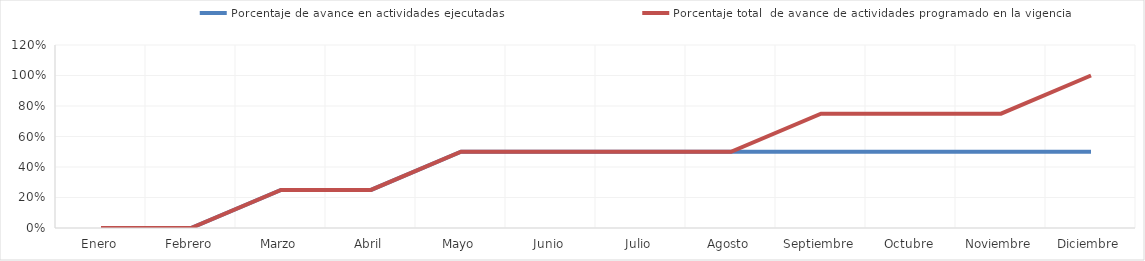
| Category | Porcentaje de avance en actividades ejecutadas | Porcentaje total  de avance de actividades programado en la vigencia |
|---|---|---|
| 0 | 0 | 0 |
| 1 | 0 | 0 |
| 2 | 0.25 | 0.25 |
| 3 | 0.25 | 0.25 |
| 4 | 0.5 | 0.5 |
| 5 | 0.5 | 0.5 |
| 6 | 0.5 | 0.5 |
| 7 | 0.5 | 0.5 |
| 8 | 0.5 | 0.75 |
| 9 | 0.5 | 0.75 |
| 10 | 0.5 | 0.75 |
| 11 | 0.5 | 1 |